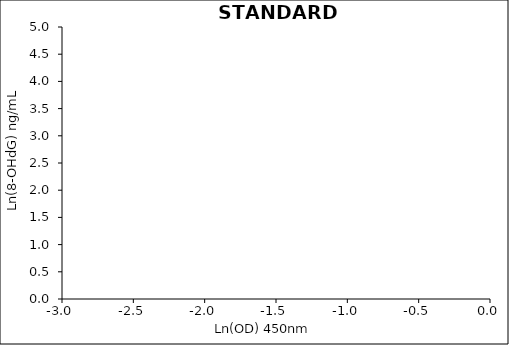
| Category | Ln(Abs) vs Ln(Conc) |
|---|---|
| 0.0 | 4.094 |
| 0.0 | 3.401 |
| 0.0 | 2.708 |
| 0.0 | 2.015 |
| 0.0 | 1.322 |
| 0.0 | 0.629 |
| 0.0 | -0.062 |